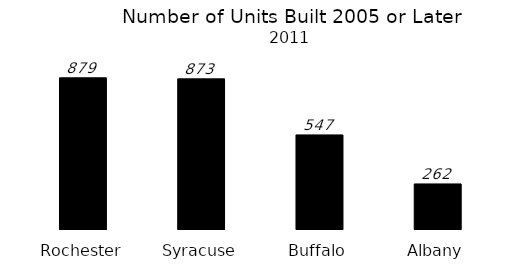
| Category | Series 0 |
|---|---|
| Rochester | 879 |
| Syracuse | 873 |
| Buffalo | 547 |
| Albany | 262 |